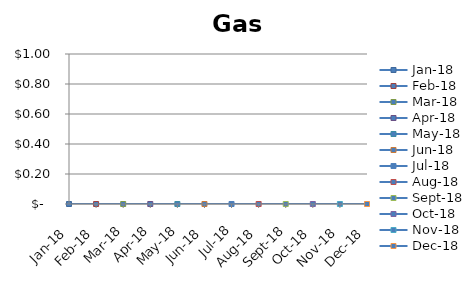
| Category | Gas |
|---|---|
| 2018-01-01 | 0 |
| 2018-02-01 | 0 |
| 2018-03-01 | 0 |
| 2018-04-01 | 0 |
| 2018-05-01 | 0 |
| 2018-06-01 | 0 |
| 2018-07-01 | 0 |
| 2018-08-01 | 0 |
| 2018-09-01 | 0 |
| 2018-10-01 | 0 |
| 2018-11-01 | 0 |
| 2018-12-01 | 0 |